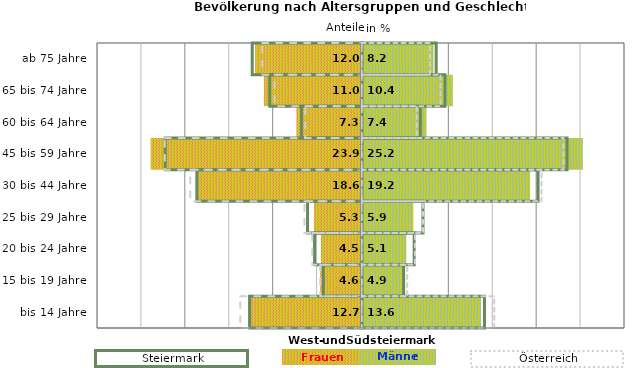
| Category | Frauen | Männer | Frauen Spalte2 | Männer Spalte2 | Frauen Spalte3 | Männer Spalte3 |
|---|---|---|---|---|---|---|
| bis 14 Jahre | -12.7 | 13.6 | 14 | -12.8 | -13.8 | 15.1 |
| 15 bis 19 Jahre | -4.6 | 4.9 | 4.8 | -4.4 | -4.7 | 5.2 |
| 20 bis 24 Jahre | -4.5 | 5.1 | 6 | -5.4 | -5.6 | 6.1 |
| 25 bis 29 Jahre | -5.3 | 5.9 | 7 | -6.2 | -6.5 | 7 |
| 30 bis 44 Jahre | -18.6 | 19.2 | 20.1 | -18.8 | -19.5 | 20.5 |
| 45 bis 59 Jahre | -23.9 | 25.2 | 23.4 | -22.4 | -22.4 | 23 |
| 60 bis 64 Jahre | -7.3 | 7.4 | 6.7 | -6.9 | -6.4 | 6.3 |
| 65 bis 74 Jahre | -11 | 10.4 | 9.5 | -10.5 | -9.9 | 9 |
| ab 75 Jahre | -12 | 8.2 | 8.5 | -12.5 | -11.3 | 7.8 |